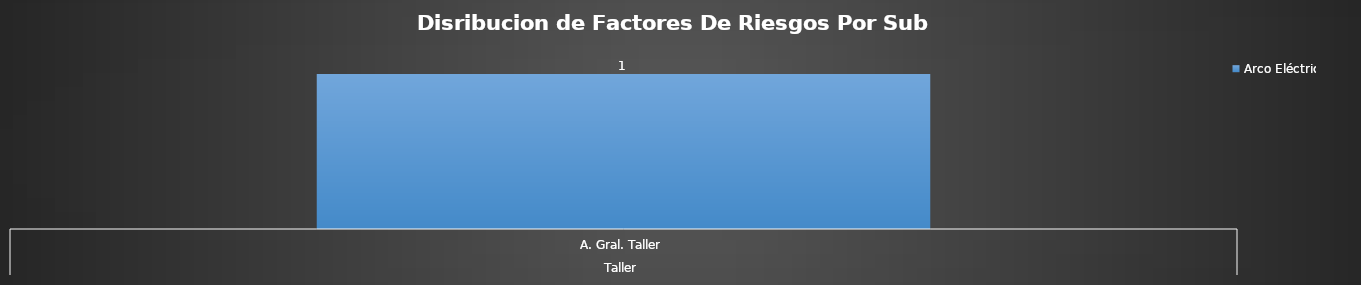
| Category | Arco Eléctrico  |
|---|---|
| 0 | 1 |